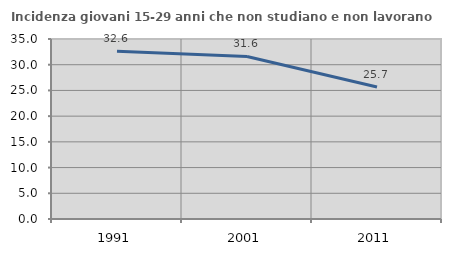
| Category | Incidenza giovani 15-29 anni che non studiano e non lavorano  |
|---|---|
| 1991.0 | 32.64 |
| 2001.0 | 31.6 |
| 2011.0 | 25.664 |